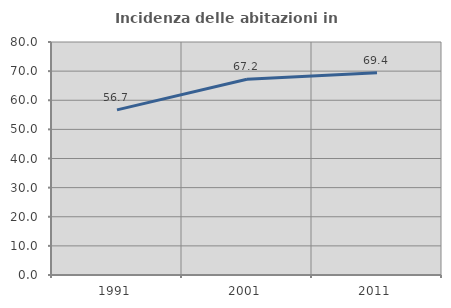
| Category | Incidenza delle abitazioni in proprietà  |
|---|---|
| 1991.0 | 56.692 |
| 2001.0 | 67.181 |
| 2011.0 | 69.433 |